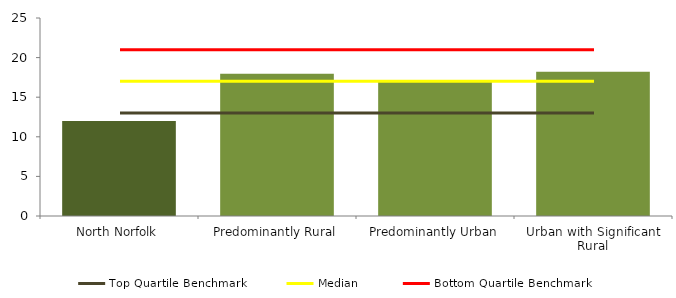
| Category | Series 0 |
|---|---|
| North Norfolk | 12 |
| Predominantly Rural | 17.958 |
| Predominantly Urban | 17.088 |
| Urban with Significant Rural | 18.211 |